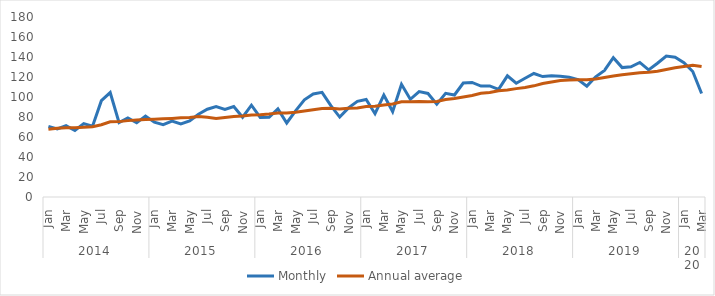
| Category | Monthly | Annual average |
|---|---|---|
| 0 | 70.677 | 67.643 |
| 1 | 68.059 | 68.683 |
| 2 | 71.261 | 69.278 |
| 3 | 66.507 | 69.237 |
| 4 | 73.414 | 69.675 |
| 5 | 70.835 | 70.272 |
| 6 | 96.314 | 72.315 |
| 7 | 104.46 | 75.188 |
| 8 | 74.459 | 75.375 |
| 9 | 79.096 | 76.377 |
| 10 | 74.297 | 76.993 |
| 11 | 80.87 | 77.521 |
| 12 | 74.827 | 77.866 |
| 13 | 72.399 | 78.228 |
| 14 | 75.938 | 78.618 |
| 15 | 73.145 | 79.171 |
| 16 | 76.042 | 79.39 |
| 17 | 82.803 | 80.388 |
| 18 | 87.763 | 79.675 |
| 19 | 90.343 | 78.498 |
| 20 | 87.562 | 79.59 |
| 21 | 90.532 | 80.543 |
| 22 | 79.77 | 80.999 |
| 23 | 91.811 | 81.911 |
| 24 | 79.566 | 82.306 |
| 25 | 79.699 | 82.915 |
| 26 | 88.034 | 83.922 |
| 27 | 74.047 | 83.998 |
| 28 | 86.193 | 84.843 |
| 29 | 97.186 | 86.042 |
| 30 | 102.989 | 87.311 |
| 31 | 104.663 | 88.504 |
| 32 | 91.312 | 88.817 |
| 33 | 79.952 | 87.935 |
| 34 | 89.137 | 88.716 |
| 35 | 95.667 | 89.037 |
| 36 | 97.461 | 90.528 |
| 37 | 83.276 | 90.826 |
| 38 | 101.97 | 91.988 |
| 39 | 85.42 | 92.935 |
| 40 | 112.676 | 95.142 |
| 41 | 97.697 | 95.185 |
| 42 | 105.375 | 95.384 |
| 43 | 103.549 | 95.291 |
| 44 | 92.906 | 95.424 |
| 45 | 103.694 | 97.402 |
| 46 | 102.006 | 98.475 |
| 47 | 113.97 | 100 |
| 48 | 114.546 | 101.424 |
| 49 | 110.919 | 103.727 |
| 50 | 111.041 | 104.483 |
| 51 | 107.605 | 106.332 |
| 52 | 121.186 | 107.041 |
| 53 | 113.788 | 108.382 |
| 54 | 118.755 | 109.497 |
| 55 | 123.521 | 111.161 |
| 56 | 120.415 | 113.454 |
| 57 | 121.214 | 114.914 |
| 58 | 120.728 | 116.474 |
| 59 | 119.775 | 116.958 |
| 60 | 117.425 | 117.198 |
| 61 | 110.849 | 117.192 |
| 62 | 120.23 | 117.958 |
| 63 | 126.62 | 119.542 |
| 64 | 139.338 | 121.055 |
| 65 | 129.417 | 122.357 |
| 66 | 130.134 | 123.306 |
| 67 | 134.581 | 124.227 |
| 68 | 127.099 | 124.784 |
| 69 | 133.761 | 125.83 |
| 70 | 140.999 | 127.519 |
| 71 | 139.769 | 129.185 |
| 72 | 134.344 | 130.595 |
| 73 | 125.485 | 131.815 |
| 74 | 103.546 | 130.424 |